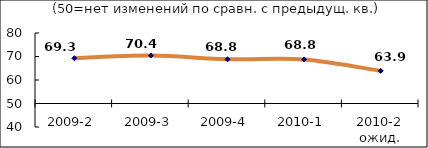
| Category | Диф.индекс ↓ |
|---|---|
| 2009-2 | 69.275 |
| 2009-3 | 70.385 |
| 2009-4 | 68.825 |
| 2010-1 | 68.76 |
| 2010-2 ожид. | 63.895 |